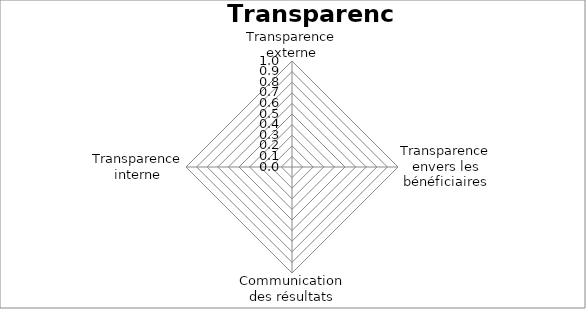
| Category | Series 0 |
|---|---|
| Transparence externe | 0 |
| Transparence envers les bénéficiaires | 0 |
| Communication des résultats | 0 |
| Transparence interne | 0 |